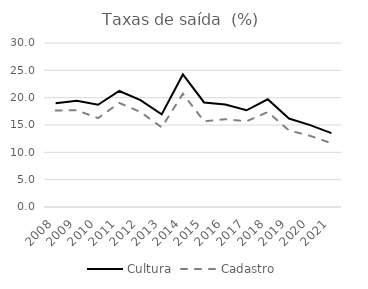
| Category | Cultura | Cadastro |
|---|---|---|
| 2008.0 | 18.99 | 17.655 |
| 2009.0 | 19.426 | 17.69 |
| 2010.0 | 18.709 | 16.255 |
| 2011.0 | 21.219 | 19.039 |
| 2012.0 | 19.544 | 17.383 |
| 2013.0 | 16.939 | 14.57 |
| 2014.0 | 24.254 | 20.713 |
| 2015.0 | 19.123 | 15.676 |
| 2016.0 | 18.756 | 16.056 |
| 2017.0 | 17.689 | 15.686 |
| 2018.0 | 19.707 | 17.368 |
| 2019.0 | 16.185 | 14.014 |
| 2020.0 | 14.973 | 13.012 |
| 2021.0 | 13.513 | 11.66 |